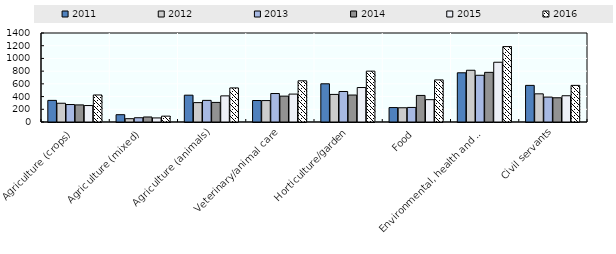
| Category | 2011 | 2012 | 2013 | 2014 | 2015 | 2016 |
|---|---|---|---|---|---|---|
| Agriculture (crops) | 340 | 295 | 275 | 269 | 259 | 425 |
| Agriculture (mixed) | 115 | 52 | 67 | 79 | 64 | 92 |
| Agriculture (animals) | 422 | 305 | 340 | 308 | 411 | 536 |
| Veterinary/animal care | 338 | 337 | 448 | 407 | 439 | 648 |
| Horticulture/garden | 601 | 434 | 480 | 424 | 542 | 800 |
| Food | 227 | 224 | 229 | 418 | 351 | 662 |
| Environmental, health and welfare | 774 | 814 | 735 | 781 | 940 | 1186 |
| Civil servants | 576 | 443 | 392 | 381 | 413 | 576 |